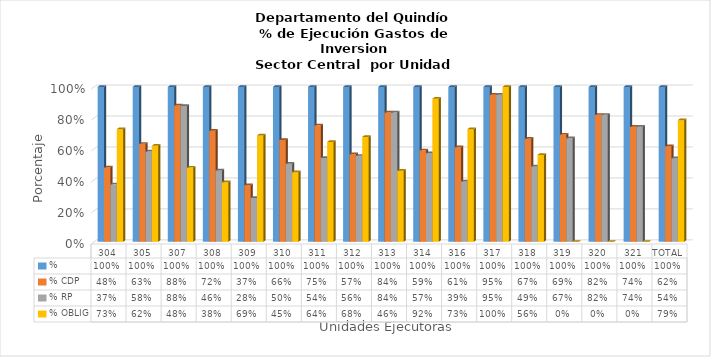
| Category | % | % CDP | % RP | % OBLIG |
|---|---|---|---|---|
| 304 | 1 | 0.48 | 0.371 | 0.727 |
| 305 | 1 | 0.633 | 0.583 | 0.62 |
| 307 | 1 | 0.88 | 0.877 | 0.479 |
| 308 | 1 | 0.717 | 0.461 | 0.385 |
| 309 | 1 | 0.366 | 0.283 | 0.687 |
| 310 | 1 | 0.658 | 0.504 | 0.45 |
| 311 | 1 | 0.752 | 0.542 | 0.645 |
| 312 | 1 | 0.566 | 0.555 | 0.678 |
| 313 | 1 | 0.835 | 0.835 | 0.459 |
| 314 | 1 | 0.591 | 0.572 | 0.924 |
| 316 | 1 | 0.611 | 0.39 | 0.727 |
| 317 | 1 | 0.95 | 0.95 | 1 |
| 318 | 1 | 0.665 | 0.487 | 0.561 |
| 319 | 1 | 0.693 | 0.669 | 0 |
| 320 | 1 | 0.82 | 0.82 | 0 |
| 321 | 1 | 0.743 | 0.743 | 0 |
| TOTAL | 1 | 0.617 | 0.54 | 0.785 |